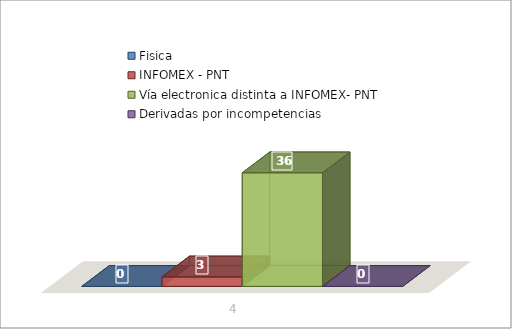
| Category | Fisica | INFOMEX - PNT | Vía electronica distinta a INFOMEX- PNT | Derivadas por incompetencias |
|---|---|---|---|---|
| 0 | 0 | 3 | 36 | 0 |